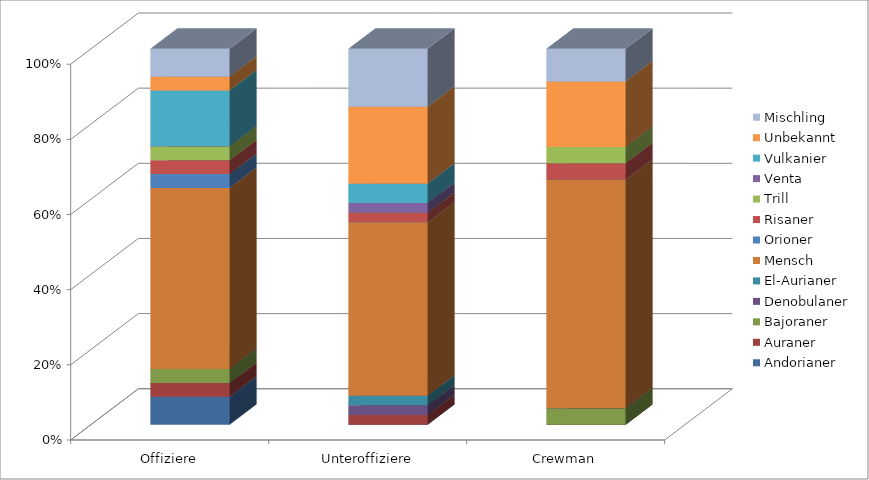
| Category | Andorianer | Auraner | Bajoraner | Denobulaner | El-Aurianer | Mensch | Orioner | Risaner | Trill | Venta | Vulkanier | Unbekannt | Mischling |
|---|---|---|---|---|---|---|---|---|---|---|---|---|---|
| 0 | 0.1 | 0.05 | 0.05 | 0 | 0 | 0.65 | 0.05 | 0.05 | 0.05 | 0 | 0.2 | 0.05 | 0.1 |
| 1 | 0 | 0.026 | 0 | 0.026 | 0.026 | 0.462 | 0 | 0.026 | 0 | 0.026 | 0.051 | 0.205 | 0.154 |
| 2 | 0 | 0 | 0.043 | 0 | 0 | 0.609 | 0 | 0.043 | 0.043 | 0 | 0 | 0.174 | 0.087 |